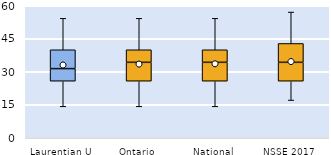
| Category | 25th | 50th | 75th |
|---|---|---|---|
| Laurentian U | 25.714 | 5.714 | 8.571 |
| Ontario | 25.714 | 8.571 | 5.714 |
| National | 25.714 | 8.571 | 5.714 |
| NSSE 2017 | 25.714 | 8.571 | 8.571 |